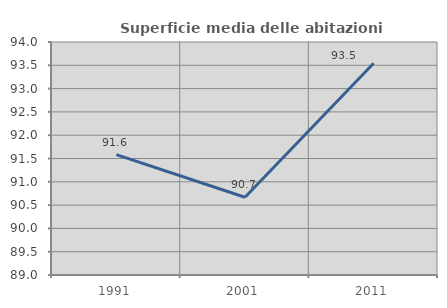
| Category | Superficie media delle abitazioni occupate |
|---|---|
| 1991.0 | 91.584 |
| 2001.0 | 90.668 |
| 2011.0 | 93.544 |